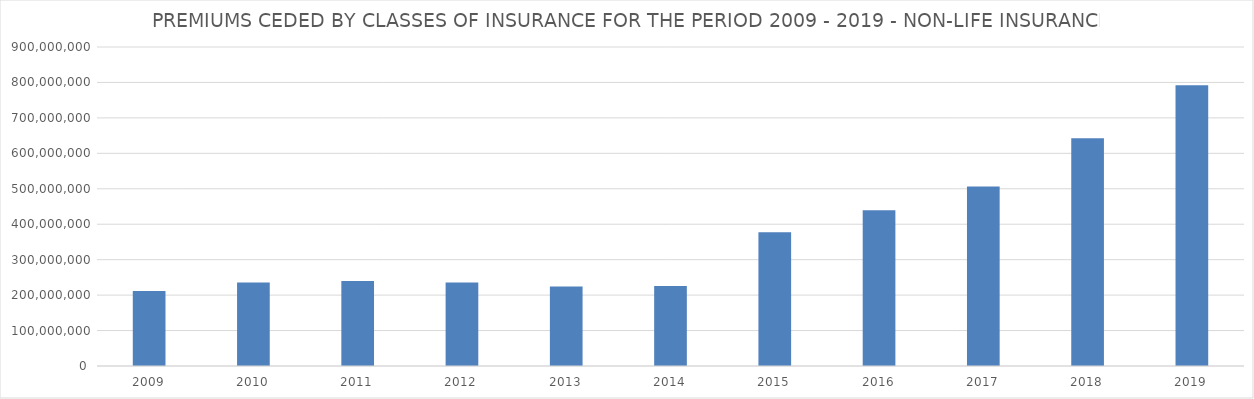
| Category | Series 0 |
|---|---|
| 2009.0 | 211607008.844 |
| 2010.0 | 235369864.249 |
| 2011.0 | 239630505.177 |
| 2012.0 | 235585203.769 |
| 2013.0 | 224010693.226 |
| 2014.0 | 225803248.762 |
| 2015.0 | 377411422.386 |
| 2016.0 | 439683141.844 |
| 2017.0 | 506089881.084 |
| 2018.0 | 642550670.561 |
| 2019.0 | 792260487.86 |